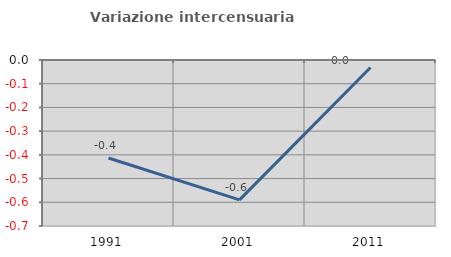
| Category | Variazione intercensuaria annua |
|---|---|
| 1991.0 | -0.413 |
| 2001.0 | -0.59 |
| 2011.0 | -0.032 |